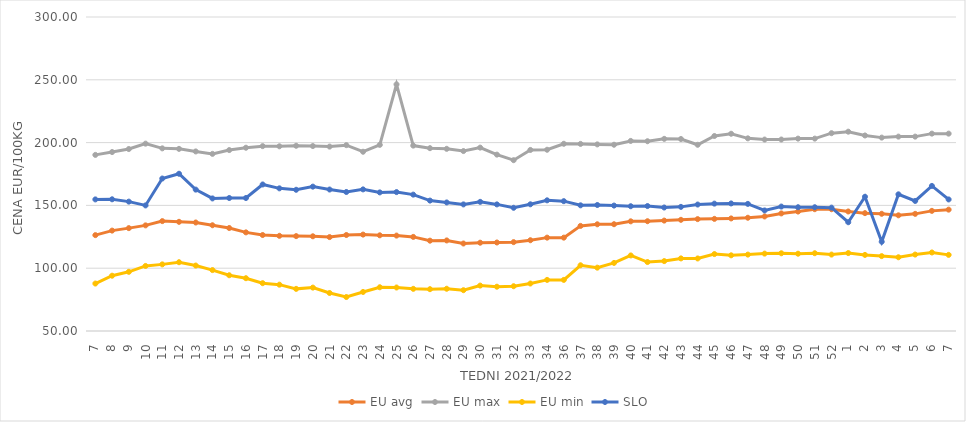
| Category | EU avg | EU max | EU min | SLO |
|---|---|---|---|---|
| 7.0 | 126.33 | 190.21 | 87.79 | 154.77 |
| 8.0 | 129.933 | 192.48 | 94.02 | 154.86 |
| 9.0 | 131.908 | 194.884 | 97.12 | 153 |
| 10.0 | 134.098 | 199.17 | 101.79 | 149.98 |
| 11.0 | 137.49 | 195.419 | 103.05 | 171.4 |
| 12.0 | 136.929 | 195.013 | 104.76 | 175.2 |
| 13.0 | 136.39 | 192.952 | 102.11 | 162.57 |
| 14.0 | 134.198 | 191.034 | 98.5 | 155.55 |
| 15.0 | 132.003 | 194.047 | 94.39 | 155.88 |
| 16.0 | 128.53 | 195.913 | 92.04 | 155.88 |
| 17.0 | 126.415 | 197.188 | 88.07 | 166.66 |
| 18.0 | 125.787 | 197.055 | 86.89 | 163.58 |
| 19.0 | 125.54 | 197.478 | 83.546 | 162.44 |
| 20.0 | 125.412 | 197.263 | 84.55 | 164.94 |
| 21.0 | 124.768 | 196.821 | 80.264 | 162.64 |
| 22.0 | 126.43 | 197.963 | 77.048 | 160.68 |
| 23.0 | 126.76 | 192.72 | 81.087 | 162.75 |
| 24.0 | 126.19 | 198.186 | 84.83 | 160.34 |
| 25.0 | 125.97 | 246.36 | 84.63 | 160.6 |
| 26.0 | 124.92 | 197.607 | 83.57 | 158.57 |
| 27.0 | 121.922 | 195.566 | 83.3 | 153.83 |
| 28.0 | 122.106 | 195.043 | 83.64 | 152.35 |
| 29.0 | 119.659 | 193.272 | 82.49 | 150.79 |
| 30.0 | 120.3 | 196.01 | 86.16 | 152.82 |
| 31.0 | 120.473 | 190.42 | 85.26 | 150.8 |
| 32.0 | 120.756 | 186 | 85.65 | 148.1 |
| 33.0 | 122.274 | 194.145 | 87.8 | 150.88 |
| 34.0 | 124.332 | 194.304 | 90.69 | 154.04 |
| 36.0 | 124.332 | 199.06 | 90.69 | 153.37 |
| 37.0 | 133.685 | 198.97 | 102.334 | 150.06 |
| 38.0 | 134.959 | 198.57 | 100.43 | 150.32 |
| 39.0 | 135.021 | 198.3 | 104.21 | 149.86 |
| 40.0 | 137.315 | 201.34 | 110.15 | 149.34 |
| 41.0 | 137.411 | 201.081 | 104.9 | 149.48 |
| 42.0 | 137.908 | 202.98 | 105.65 | 148.32 |
| 43.0 | 138.52 | 202.856 | 107.8 | 148.83 |
| 44.0 | 139.076 | 198.26 | 107.75 | 150.69 |
| 45.0 | 139.275 | 205.257 | 111.25 | 151.41 |
| 46.0 | 139.626 | 207.046 | 110.26 | 151.56 |
| 47.0 | 140.17 | 203.387 | 110.83 | 151.2 |
| 48.0 | 141.2 | 202.42 | 111.62 | 145.97 |
| 49.0 | 143.614 | 202.45 | 111.89 | 149.07 |
| 50.0 | 145.101 | 203.17 | 111.54 | 148.55 |
| 51.0 | 146.984 | 203.17 | 111.93 | 148.54 |
| 52.0 | 146.958 | 207.5 | 110.85 | 148.22 |
| 1.0 | 145.157 | 208.7 | 112.04 | 136.59 |
| 2.0 | 143.842 | 205.67 | 110.59 | 156.88 |
| 3.0 | 143.324 | 203.97 | 109.62 | 121.07 |
| 4.0 | 142.105 | 204.76 | 108.71 | 158.82 |
| 5.0 | 143.269 | 204.76 | 110.86 | 153.55 |
| 6.0 | 145.648 | 207.14 | 112.52 | 165.51 |
| 7.0 | 146.63 | 207.14 | 110.619 | 154.74 |